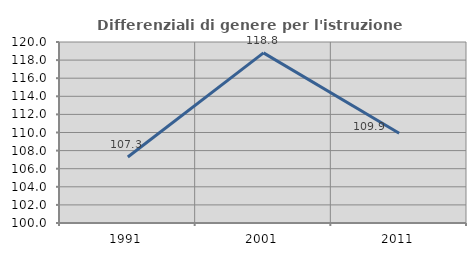
| Category | Differenziali di genere per l'istruzione superiore |
|---|---|
| 1991.0 | 107.292 |
| 2001.0 | 118.8 |
| 2011.0 | 109.921 |